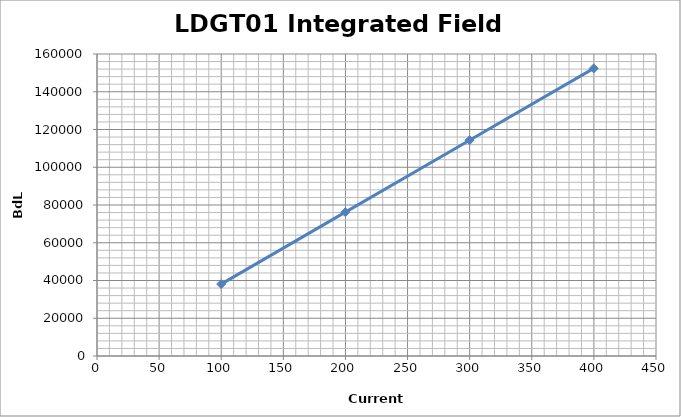
| Category | Series 0 |
|---|---|
| 99.95950194552523 | 38104.012 |
| 199.9323045395565 | 76199.874 |
| 299.9161063553831 | 114325.597 |
| 399.88291569390356 | 152373.472 |